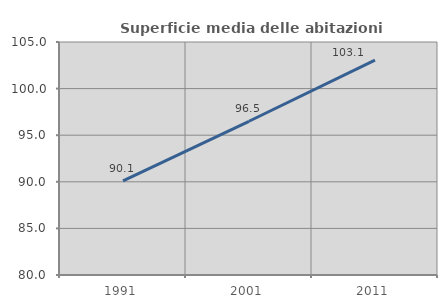
| Category | Superficie media delle abitazioni occupate |
|---|---|
| 1991.0 | 90.092 |
| 2001.0 | 96.494 |
| 2011.0 | 103.057 |